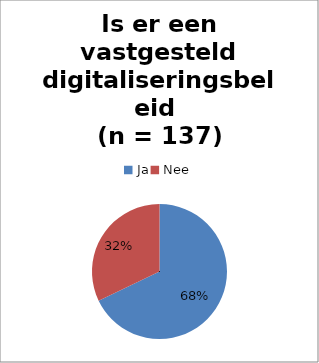
| Category | Series 0 |
|---|---|
| Ja | 93 |
| Nee | 44 |